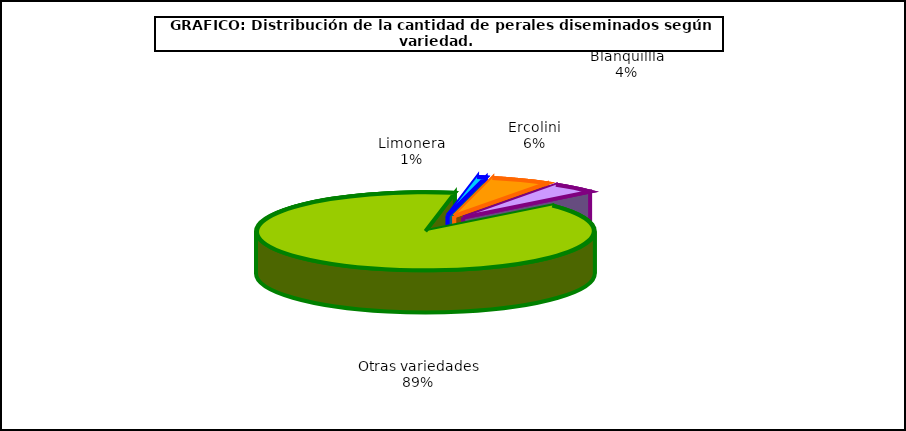
| Category | arboles |
|---|---|
| 0 | 4.305 |
| 1 | 29.141 |
| 2 | 22.186 |
| 3 | 464.657 |